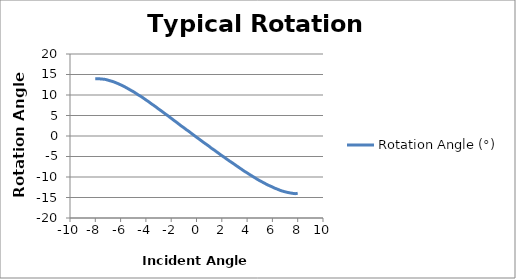
| Category | Rotation Angle (°) |
|---|---|
| -8.0 | 13.94 |
| -7.8 | 13.962 |
| -7.6 | 13.929 |
| -7.4 | 13.867 |
| -7.2 | 13.795 |
| -7.0 | 13.623 |
| -6.8 | 13.44 |
| -6.6 | 13.264 |
| -6.4 | 13.022 |
| -6.2 | 12.771 |
| -6.0 | 12.486 |
| -5.8 | 12.206 |
| -5.6 | 11.868 |
| -5.4 | 11.518 |
| -5.2 | 11.166 |
| -5.0 | 10.823 |
| -4.8 | 10.438 |
| -4.6 | 10.022 |
| -4.4 | 9.663 |
| -4.2 | 9.246 |
| -4.0 | 8.813 |
| -3.8 | 8.39 |
| -3.6 | 7.934 |
| -3.4 | 7.508 |
| -3.2 | 7.066 |
| -3.0 | 6.59 |
| -2.8 | 6.16 |
| -2.6 | 5.693 |
| -2.4 | 5.244 |
| -2.2 | 4.796 |
| -2.0 | 4.32 |
| -1.8 | 3.849 |
| -1.6 | 3.394 |
| -1.4 | 2.919 |
| -1.2 | 2.442 |
| -1.0 | 2.016 |
| -0.8 | 1.533 |
| -0.6 | 1.115 |
| -0.4 | 0.638 |
| -0.2 | 0.169 |
| 0.0 | -0.295 |
| 0.2 | -0.732 |
| 0.4 | -1.201 |
| 0.6 | -1.654 |
| 0.8 | -2.084 |
| 1.0 | -2.527 |
| 1.2 | -3.018 |
| 1.4 | -3.424 |
| 1.6 | -3.886 |
| 1.8 | -4.329 |
| 2.0 | -4.784 |
| 2.2 | -5.196 |
| 2.4 | -5.652 |
| 2.6 | -6.083 |
| 2.8 | -6.49 |
| 3.0 | -6.913 |
| 3.2 | -7.351 |
| 3.4 | -7.769 |
| 3.6 | -8.197 |
| 3.8 | -8.627 |
| 4.0 | -8.991 |
| 4.2 | -9.396 |
| 4.4 | -9.779 |
| 4.6 | -10.154 |
| 4.8 | -10.55 |
| 5.0 | -10.895 |
| 5.2 | -11.224 |
| 5.4 | -11.556 |
| 5.6 | -11.882 |
| 5.8 | -12.171 |
| 6.0 | -12.436 |
| 6.2 | -12.741 |
| 6.4 | -12.971 |
| 6.6 | -13.234 |
| 6.8 | -13.439 |
| 7.0 | -13.611 |
| 7.2 | -13.762 |
| 7.4 | -13.878 |
| 7.6 | -13.984 |
| 7.8 | -14.061 |
| 8.0 | -13.986 |